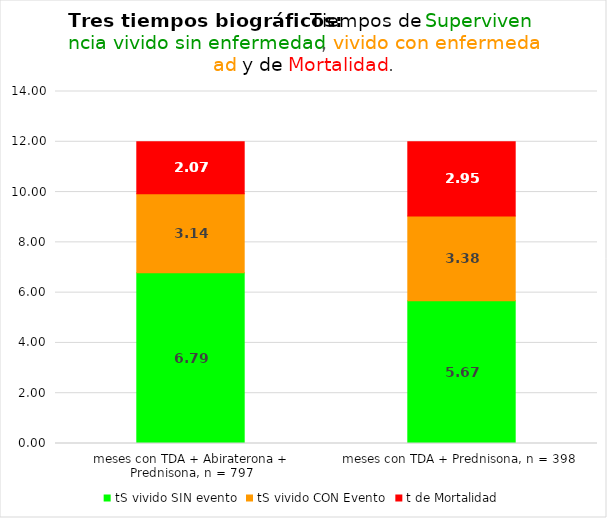
| Category | tS vivido SIN evento | tS vivido CON Evento | t de Mortalidad |
|---|---|---|---|
| meses con TDA + Abiraterona + Prednisona, n = 797 | 6.787 | 3.145 | 2.068 |
| meses con TDA + Prednisona, n = 398 | 5.675 | 3.377 | 2.948 |